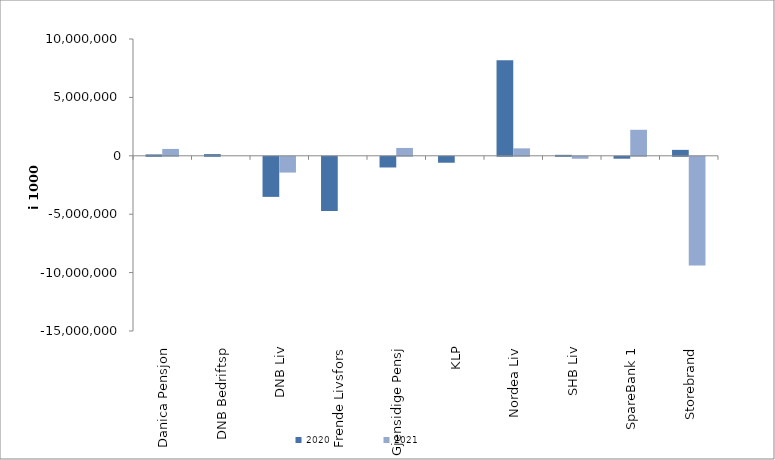
| Category | 2020 | 2021 |
|---|---|---|
| Danica Pensjon | 119419.5 | 587775.538 |
| DNB Bedriftsp | 143940 | 0 |
| DNB Liv | -3431819 | -1350455 |
| Frende Livsfors | -4640062 | 0 |
| Gjensidige Pensj | -914343 | 671451 |
| KLP | -507465.172 | 0 |
| Nordea Liv | 8176088.13 | 638296 |
| SHB Liv | 82451.076 | -166180.456 |
| SpareBank 1 | -162317.008 | 2226185.166 |
| Storebrand | 507642.658 | -9298668.836 |